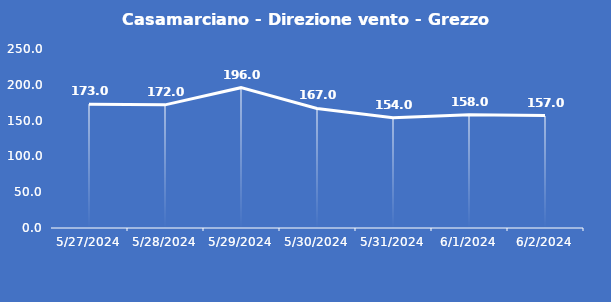
| Category | Casamarciano - Direzione vento - Grezzo (°N) |
|---|---|
| 5/27/24 | 173 |
| 5/28/24 | 172 |
| 5/29/24 | 196 |
| 5/30/24 | 167 |
| 5/31/24 | 154 |
| 6/1/24 | 158 |
| 6/2/24 | 157 |